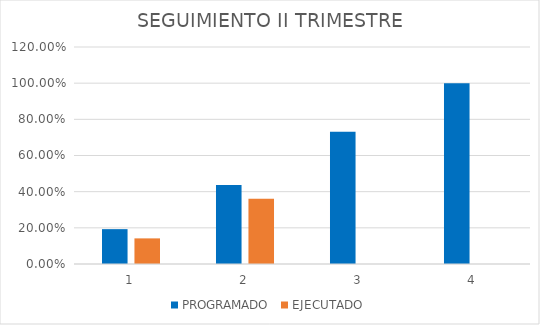
| Category | PROGRAMADO | EJECUTADO |
|---|---|---|
| 0 | 0.193 | 0.142 |
| 1 | 0.438 | 0.36 |
| 2 | 0.731 | 0 |
| 3 | 1 | 0 |